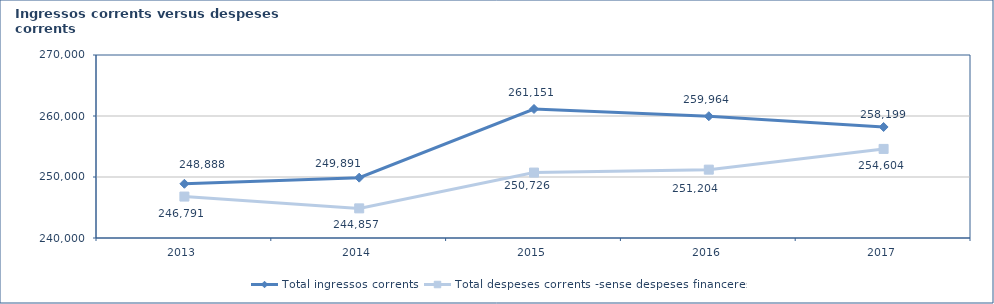
| Category | Total ingressos corrents  | Total despeses corrents -sense despeses financeres- |
|---|---|---|
| 2013.0 | 248888.004 | 246790.504 |
| 2014.0 | 249891.457 | 244856.559 |
| 2015.0 | 261150.541 | 250726.221 |
| 2016.0 | 259964.012 | 251204.456 |
| 2017.0 | 258199.011 | 254604.498 |